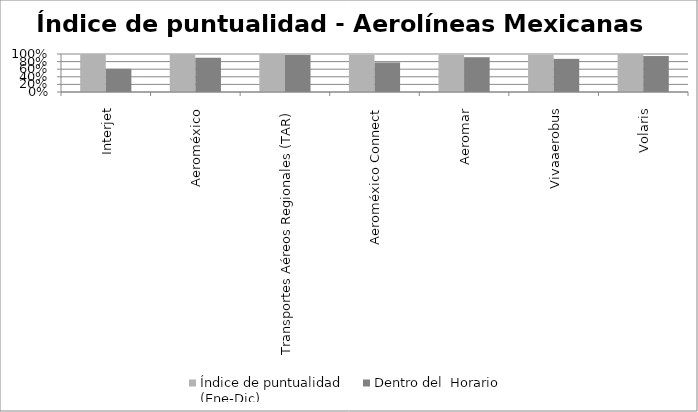
| Category | Índice de puntualidad
(Ene-Dic) | Dentro del  Horario |
|---|---|---|
| Interjet | 0.994 | 0.611 |
| Aeroméxico | 0.99 | 0.902 |
| Transportes Aéreos Regionales (TAR) | 0.998 | 0.976 |
| Aeroméxico Connect | 0.978 | 0.777 |
| Aeromar | 0.983 | 0.915 |
| Vivaaerobus | 0.98 | 0.873 |
| Volaris | 0.995 | 0.946 |